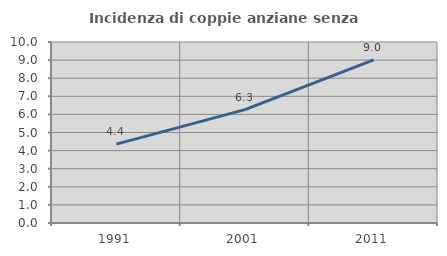
| Category | Incidenza di coppie anziane senza figli  |
|---|---|
| 1991.0 | 4.36 |
| 2001.0 | 6.266 |
| 2011.0 | 9.011 |